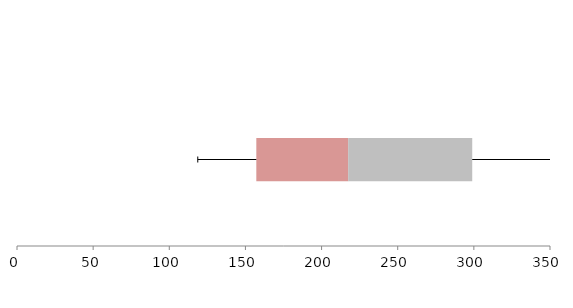
| Category | Series 1 | Series 2 | Series 3 |
|---|---|---|---|
| 0 | 157.151 | 60.305 | 81.473 |